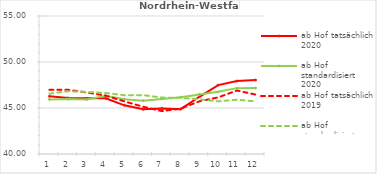
| Category | ab Hof tatsächlich 2020 | ab Hof standardisiert 2020 | ab Hof tatsächlich 2019 | ab Hof standardisiert 2019 |
|---|---|---|---|---|
| 0 | 46.271 | 45.928 | 46.975 | 46.556 |
| 1 | 46.094 | 45.986 | 46.979 | 46.826 |
| 2 | 46.056 | 45.928 | 46.686 | 46.742 |
| 3 | 46.06 | 46.325 | 46.35 | 46.633 |
| 4 | 45.292 | 45.96 | 45.719 | 46.382 |
| 5 | 44.855 | 45.795 | 45.135 | 46.399 |
| 6 | 44.955 | 45.984 | 44.661 | 46.133 |
| 7 | 44.876 | 46.176 | 44.93 | 46.105 |
| 8 | 46.219 | 46.475 | 45.727 | 45.939 |
| 9 | 47.49 | 46.755 | 46.154 | 45.727 |
| 10 | 47.929 | 47.16 | 46.898 | 45.904 |
| 11 | 48.038 | 47.172 | 46.459 | 45.713 |